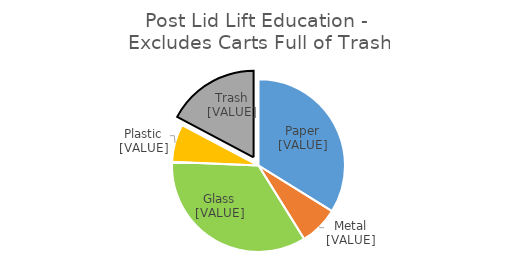
| Category | Series 0 |
|---|---|
| Paper | 0.338 |
| Metals | 0.073 |
| Glass | 0.345 |
| Plastic | 0.071 |
| Trash  | 0.173 |